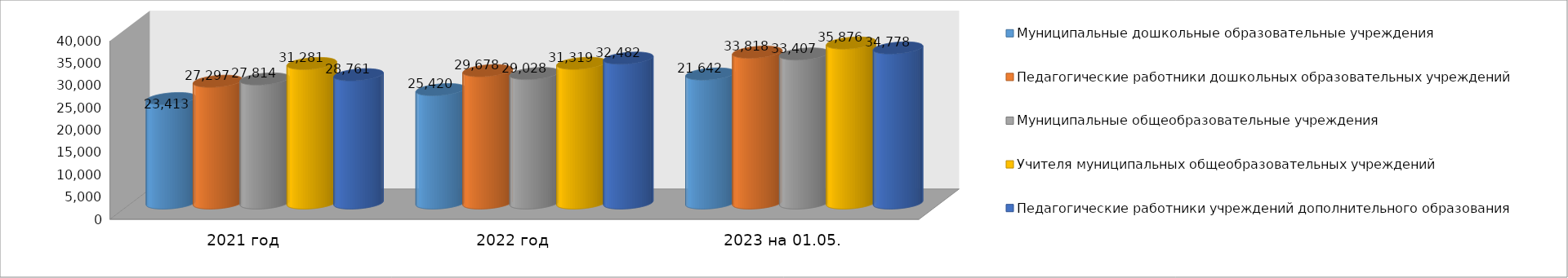
| Category | Муниципальные дошкольные образовательные учреждения | Педагогические работники дошкольных образовательных учреждений | Муниципальные общеобразовательные учреждения | Учителя муниципальных общеобразовательных учреждений | Педагогические работники учреждений дополнительного образования |
|---|---|---|---|---|---|
| 2021 год | 23413 | 27297 | 27814 | 31281 | 28761 |
| 2022 год | 25420 | 29678 | 29028 | 31319 | 32482 |
| 2023 на 01.05. | 28928 | 33818 | 33407 | 35876 | 34778 |